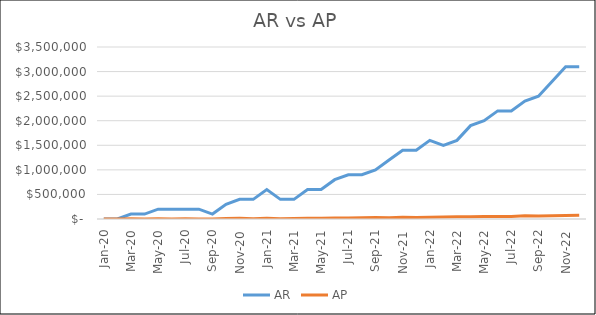
| Category | AR | AP |
|---|---|---|
| 2020-01-01 | 0 | 0 |
| 2020-02-29 | 0 | 0 |
| 2020-03-31 | 100000 | 5178.082 |
| 2020-04-30 | 100000 | 739.726 |
| 2020-05-31 | 200000 | 5917.808 |
| 2020-06-30 | 200000 | 1479.452 |
| 2020-07-31 | 200000 | 6657.534 |
| 2020-08-31 | 200000 | 2219.178 |
| 2020-09-30 | 100000 | 2219.178 |
| 2020-10-31 | 300000 | 12575.342 |
| 2020-11-30 | 400000 | 14054.795 |
| 2020-12-31 | 400000 | 5178.082 |
| 2021-01-31 | 600000 | 15534.247 |
| 2021-02-28 | 400000 | 6657.534 |
| 2021-03-31 | 400000 | 11835.616 |
| 2021-04-30 | 600000 | 17753.425 |
| 2021-05-31 | 600000 | 14054.795 |
| 2021-06-30 | 800000 | 19972.603 |
| 2021-07-31 | 900000 | 21452.055 |
| 2021-08-31 | 900000 | 22931.507 |
| 2021-09-30 | 1000000 | 29589.041 |
| 2021-10-31 | 1200000 | 26630.137 |
| 2021-11-30 | 1400000 | 33287.671 |
| 2021-12-31 | 1400000 | 30328.767 |
| 2022-01-31 | 1600000 | 36986.301 |
| 2022-02-28 | 1500000 | 39205.479 |
| 2022-03-31 | 1600000 | 46602.74 |
| 2022-04-30 | 1900000 | 44383.562 |
| 2022-05-31 | 2000000 | 51780.822 |
| 2022-06-30 | 2200000 | 49561.644 |
| 2022-07-31 | 2200000 | 51780.822 |
| 2022-08-31 | 2400000 | 64356.164 |
| 2022-09-30 | 2500000 | 62876.712 |
| 2022-10-31 | 2800000 | 65835.616 |
| 2022-11-30 | 3100000 | 68794.521 |
| 2022-12-31 | 3100000 | 76931.507 |